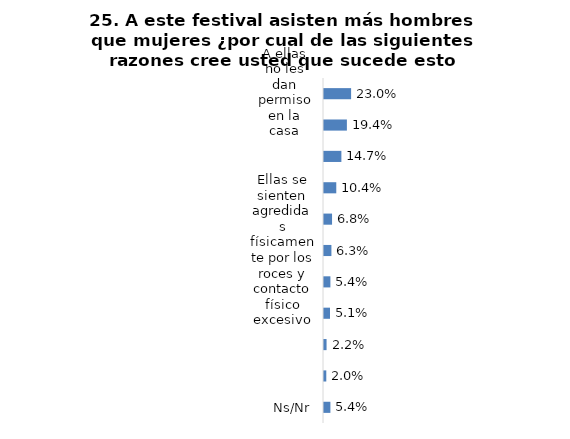
| Category | Series 0 |
|---|---|
| A ellas no les dan permiso en la casa | 0.23 |
| Ellas tienen temor a la inseguridad | 0.194 |
| A ellas les gusta menos el hip hop que a los hombres | 0.147 |
| A ellas les parecen incomodas las requisas | 0.104 |
| Ellas tienen temor a las multitudes | 0.068 |
| Ellas se sienten agredidas físicamente por los roces y contacto físico excesivo | 0.063 |
| A ellas les parecen incomodos los baños | 0.054 |
| A ellas les da miedo tomar transporte a la salida | 0.051 |
| Ellas no consiguen quien las acompañe al festival | 0.022 |
| Otra  | 0.02 |
| Ns/Nr | 0.054 |